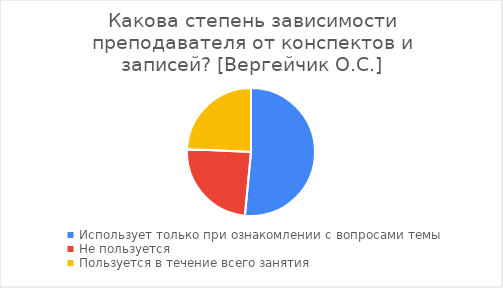
| Category | Series 0 |
|---|---|
| Использует только при ознакомлении с вопросами темы | 51 |
| Не пользуется | 24 |
| Пользуется в течение всего занятия | 24 |